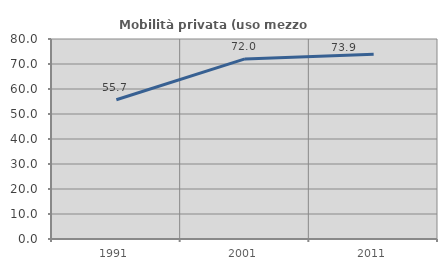
| Category | Mobilità privata (uso mezzo privato) |
|---|---|
| 1991.0 | 55.679 |
| 2001.0 | 72.026 |
| 2011.0 | 73.909 |